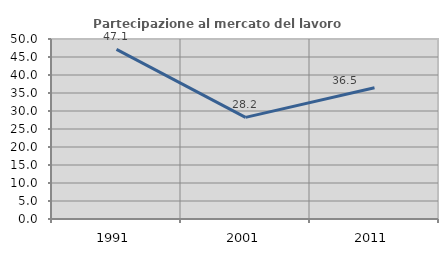
| Category | Partecipazione al mercato del lavoro  femminile |
|---|---|
| 1991.0 | 47.126 |
| 2001.0 | 28.235 |
| 2011.0 | 36.471 |